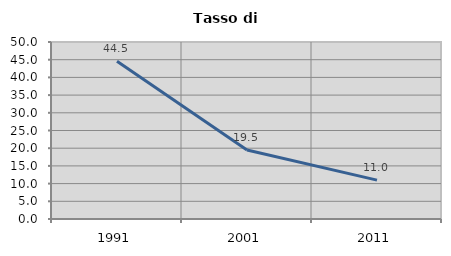
| Category | Tasso di disoccupazione   |
|---|---|
| 1991.0 | 44.536 |
| 2001.0 | 19.509 |
| 2011.0 | 10.984 |